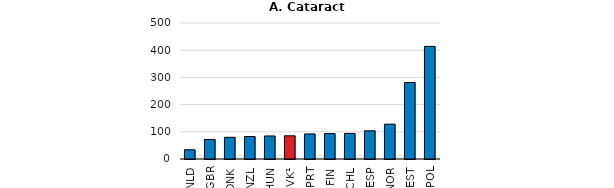
| Category | Series 0 |
|---|---|
| NLD | 33.9 |
| GBR | 71.7 |
| DNK | 79.7 |
| NZL | 82.5 |
| HUN | 84.7 |
| SVK¹ | 85.333 |
| PRT | 92.1 |
| FIN | 93.5 |
| CHL | 94 |
| ESP | 103.7 |
| NOR | 128 |
| EST | 281 |
| POL | 414 |